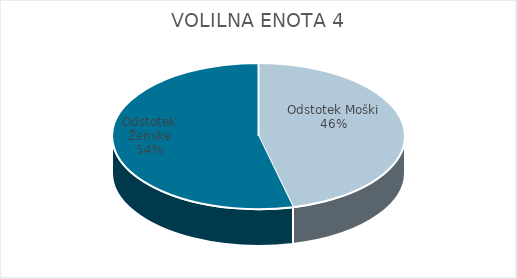
| Category | VOLILNA ENOTA 4 | #REF! | Slovenija skupaj |
|---|---|---|---|
| Odstotek Moški | 23.1 |  | 21.63 |
| Odstotek Ženske | 26.88 |  | 24.53 |